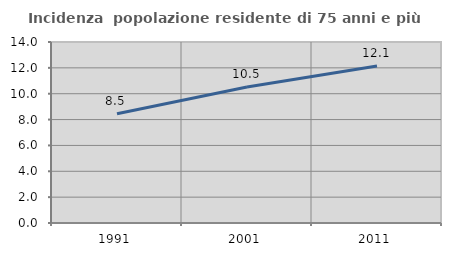
| Category | Incidenza  popolazione residente di 75 anni e più |
|---|---|
| 1991.0 | 8.454 |
| 2001.0 | 10.526 |
| 2011.0 | 12.136 |